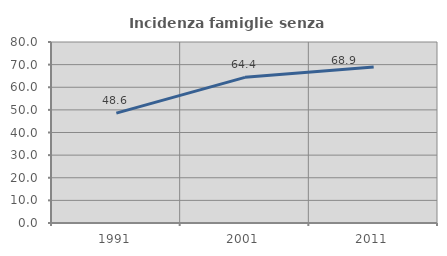
| Category | Incidenza famiglie senza nuclei |
|---|---|
| 1991.0 | 48.551 |
| 2001.0 | 64.375 |
| 2011.0 | 68.944 |